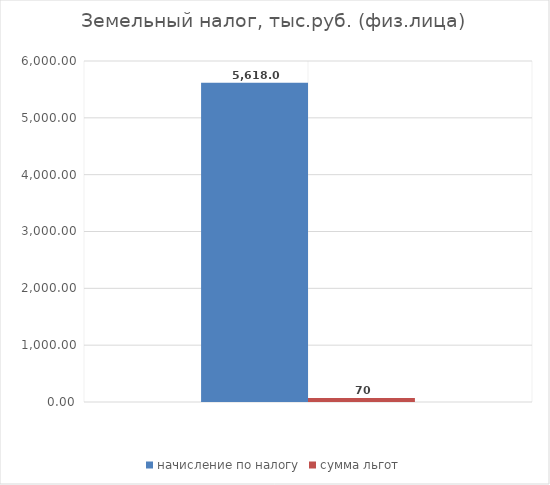
| Category | начисление по налогу | сумма льгот |
|---|---|---|
| 0 | 5618 | 70 |